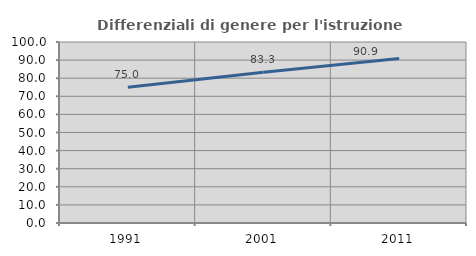
| Category | Differenziali di genere per l'istruzione superiore |
|---|---|
| 1991.0 | 75 |
| 2001.0 | 83.333 |
| 2011.0 | 90.867 |